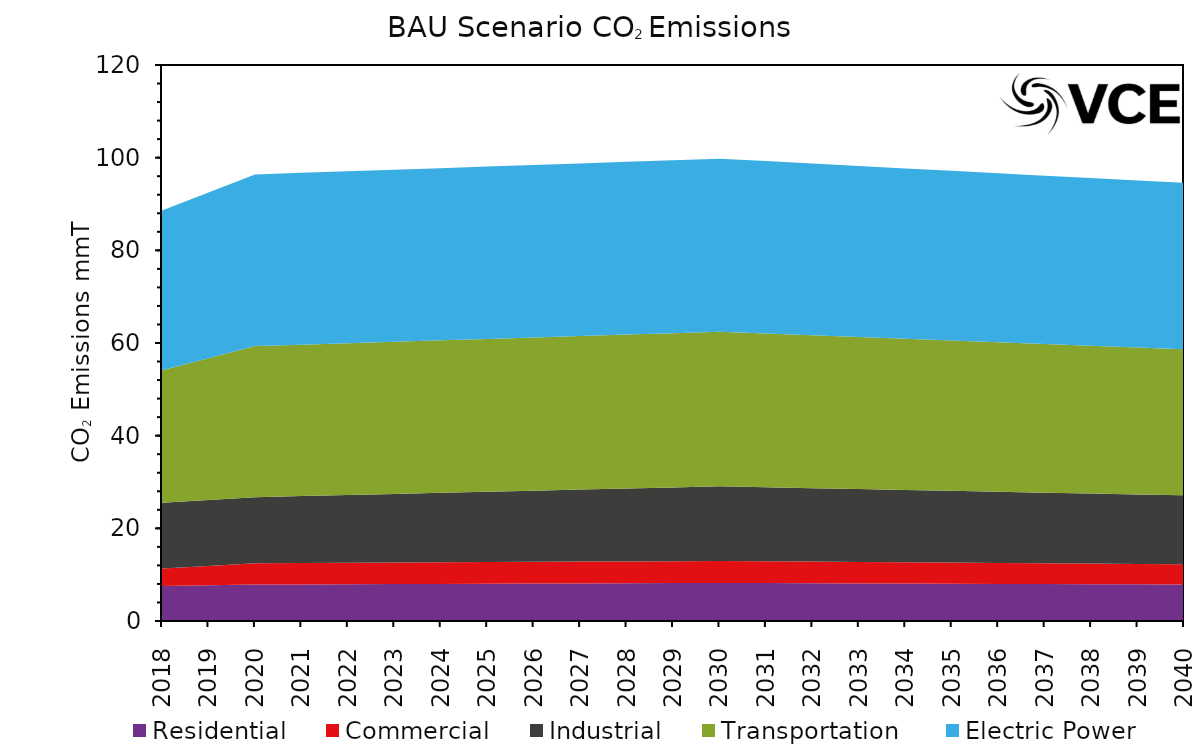
| Category | Residential | Commercial | Industrial | Transportation  | Electric Power  |
|---|---|---|---|---|---|
| 2018.0 | 7.535 | 3.793 | 14.212 | 28.599 | 34.44 |
| 2019.0 | 7.697 | 4.197 | 14.241 | 30.599 | 35.745 |
| 2020.0 | 7.86 | 4.6 | 14.27 | 32.6 | 37.05 |
| 2021.0 | 7.896 | 4.615 | 14.452 | 32.677 | 37.08 |
| 2022.0 | 7.932 | 4.63 | 14.634 | 32.754 | 37.11 |
| 2023.0 | 7.968 | 4.645 | 14.816 | 32.831 | 37.14 |
| 2024.0 | 8.004 | 4.66 | 14.998 | 32.908 | 37.17 |
| 2025.0 | 8.04 | 4.675 | 15.18 | 32.985 | 37.2 |
| 2026.0 | 8.076 | 4.69 | 15.362 | 33.062 | 37.23 |
| 2027.0 | 8.112 | 4.705 | 15.544 | 33.139 | 37.26 |
| 2028.0 | 8.148 | 4.72 | 15.726 | 33.216 | 37.29 |
| 2029.0 | 8.184 | 4.735 | 15.908 | 33.293 | 37.32 |
| 2030.0 | 8.22 | 4.75 | 16.09 | 33.37 | 37.35 |
| 2031.0 | 8.185 | 4.713 | 15.967 | 33.185 | 37.207 |
| 2032.0 | 8.15 | 4.676 | 15.844 | 33 | 37.064 |
| 2033.0 | 8.115 | 4.639 | 15.721 | 32.815 | 36.921 |
| 2034.0 | 8.08 | 4.602 | 15.598 | 32.63 | 36.778 |
| 2035.0 | 8.045 | 4.565 | 15.475 | 32.445 | 36.635 |
| 2036.0 | 8.01 | 4.528 | 15.352 | 32.26 | 36.492 |
| 2037.0 | 7.975 | 4.491 | 15.229 | 32.075 | 36.349 |
| 2038.0 | 7.94 | 4.454 | 15.106 | 31.89 | 36.206 |
| 2039.0 | 7.905 | 4.417 | 14.983 | 31.705 | 36.063 |
| 2040.0 | 7.87 | 4.38 | 14.86 | 31.52 | 35.92 |